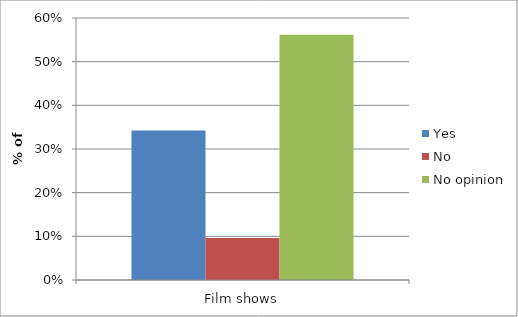
| Category | Yes | No | No opinion |
|---|---|---|---|
| Film shows | 0.342 | 0.096 | 0.561 |